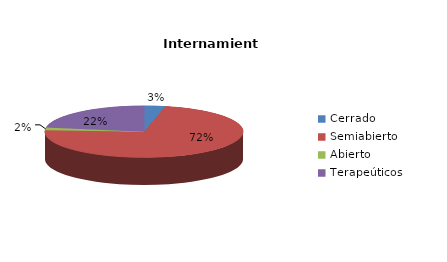
| Category | Series 0 |
|---|---|
| Cerrado | 2 |
| Semiabierto | 42 |
| Abierto | 1 |
| Terapeúticos | 13 |